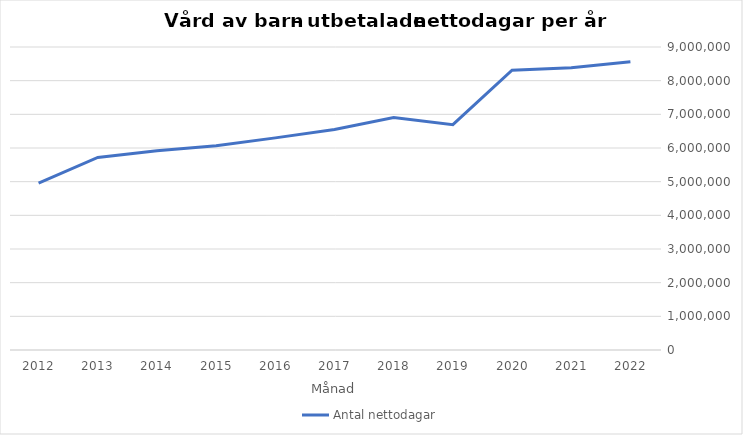
| Category | Antal nettodagar |
|---|---|
| 2022.0 | 8563132 |
| 2021.0 | 8381430 |
| 2020.0 | 8309870 |
| 2019.0 | 6694133 |
| 2018.0 | 6904413 |
| 2017.0 | 6551491 |
| 2016.0 | 6300721 |
| 2015.0 | 6069362 |
| 2014.0 | 5920029 |
| 2013.0 | 5718425 |
| 2012.0 | 4959238 |